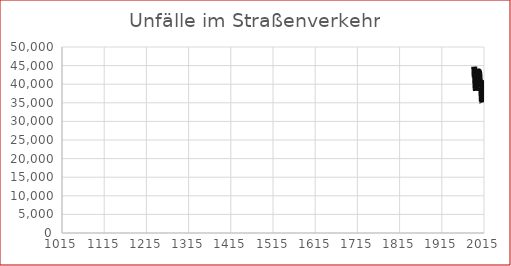
| Category | Unfälle |
|---|---|
| 1992.0 | 44730 |
| 1993.0 | 41791 |
| 1994.0 | 42015 |
| 1995.0 | 38956 |
| 1996.0 | 38253 |
| 1997.0 | 39695 |
| 1998.0 | 39225 |
| 1999.0 | 42348 |
| 2000.0 | 42126 |
| 2001.0 | 43073 |
| 2002.0 | 43175 |
| 2003.0 | 43426 |
| 2004.0 | 42657 |
| 2005.0 | 40896 |
| 2006.0 | 39884 |
| 2007.0 | 41096 |
| 2008.0 | 39173 |
| 2009.0 | 37925 |
| 2010.0 | 35348 |
| 2011.0 | 35129 |
| 2012.0 | 40831 |
| 2013.0 | 38502 |
| 2014.0 | 37957 |